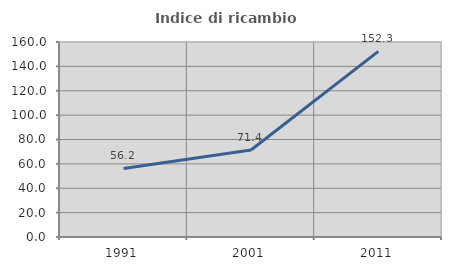
| Category | Indice di ricambio occupazionale  |
|---|---|
| 1991.0 | 56.24 |
| 2001.0 | 71.429 |
| 2011.0 | 152.258 |